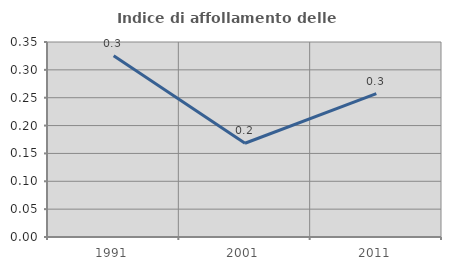
| Category | Indice di affollamento delle abitazioni  |
|---|---|
| 1991.0 | 0.325 |
| 2001.0 | 0.168 |
| 2011.0 | 0.257 |